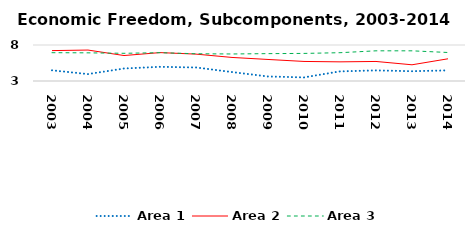
| Category | Area 1 | Area 2 | Area 3 |
|---|---|---|---|
| 2003.0 | 4.486 | 7.222 | 6.932 |
| 2004.0 | 3.959 | 7.299 | 6.911 |
| 2005.0 | 4.737 | 6.536 | 6.847 |
| 2006.0 | 4.971 | 6.944 | 6.932 |
| 2007.0 | 4.878 | 6.735 | 6.785 |
| 2008.0 | 4.245 | 6.272 | 6.754 |
| 2009.0 | 3.629 | 5.992 | 6.802 |
| 2010.0 | 3.501 | 5.716 | 6.831 |
| 2011.0 | 4.338 | 5.66 | 6.93 |
| 2012.0 | 4.473 | 5.714 | 7.192 |
| 2013.0 | 4.362 | 5.251 | 7.192 |
| 2014.0 | 4.474 | 6.084 | 6.958 |